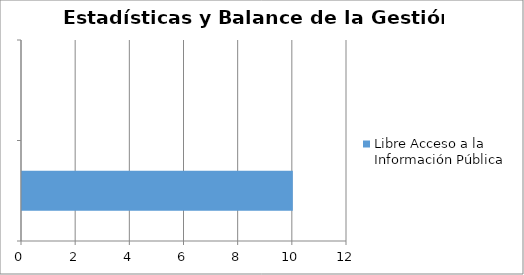
| Category | Libre Acceso a la Información Pública |
|---|---|
|  | 10 |
|  | 0 |